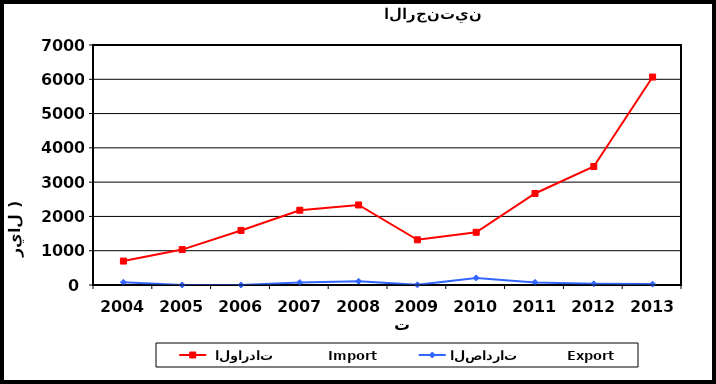
| Category |  الواردات           Import | الصادرات          Export |
|---|---|---|
| 2004.0 | 698 | 79 |
| 2005.0 | 1033 | 1 |
| 2006.0 | 1591 | 1 |
| 2007.0 | 2181 | 71 |
| 2008.0 | 2334 | 109 |
| 2009.0 | 1318 | 5 |
| 2010.0 | 1538 | 206 |
| 2011.0 | 2669 | 76 |
| 2012.0 | 3456 | 34 |
| 2013.0 | 6065 | 26 |